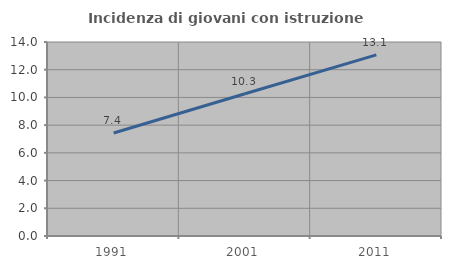
| Category | Incidenza di giovani con istruzione universitaria |
|---|---|
| 1991.0 | 7.434 |
| 2001.0 | 10.268 |
| 2011.0 | 13.075 |